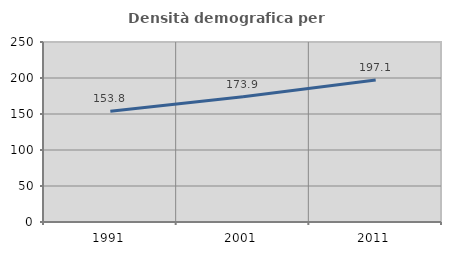
| Category | Densità demografica |
|---|---|
| 1991.0 | 153.811 |
| 2001.0 | 173.856 |
| 2011.0 | 197.127 |